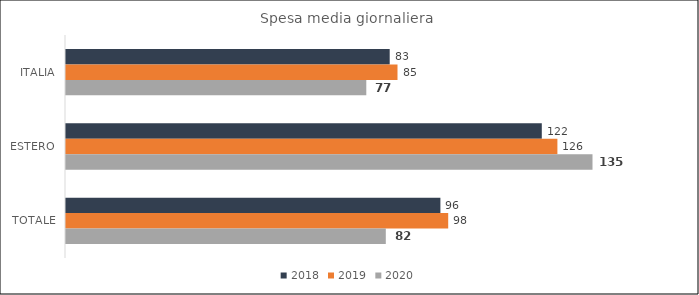
| Category | 2018 | 2019 | 2020 |
|---|---|---|---|
| ITALIA | 83 | 85 | 77 |
| ESTERO | 122 | 126 | 135 |
| TOTALE | 96 | 98 | 82 |